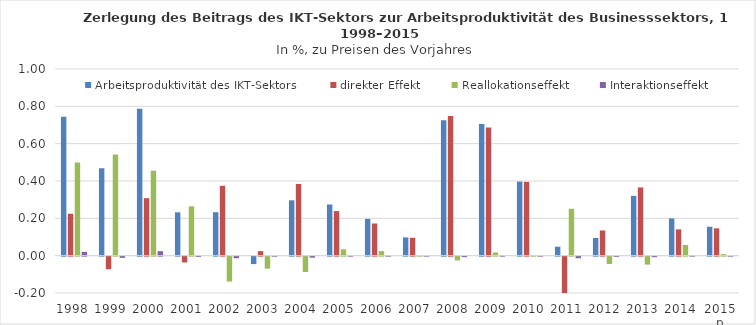
| Category | Arbeitsproduktivität des IKT-Sektors | direkter Effekt | Reallokationseffekt | Interaktionseffekt |
|---|---|---|---|---|
| 1998 | 0.744 | 0.225 | 0.499 | 0.02 |
| 1999 | 0.468 | -0.067 | 0.542 | -0.006 |
| 2000 | 0.787 | 0.308 | 0.455 | 0.024 |
| 2001 | 0.232 | -0.031 | 0.265 | -0.001 |
| 2002 | 0.233 | 0.374 | -0.133 | -0.008 |
| 2003 | -0.04 | 0.024 | -0.064 | 0 |
| 2004 | 0.297 | 0.384 | -0.082 | -0.005 |
| 2005 | 0.274 | 0.239 | 0.034 | 0.001 |
| 2006 | 0.197 | 0.172 | 0.024 | 0.001 |
| 2007 | 0.098 | 0.096 | 0.002 | 0 |
| 2008 | 0.726 | 0.748 | -0.02 | -0.003 |
| 2009 | 0.705 | 0.686 | 0.017 | 0.002 |
| 2010 | 0.397 | 0.395 | 0.002 | 0 |
| 2011 | 0.048 | -0.195 | 0.251 | -0.008 |
| 2012 | 0.095 | 0.135 | -0.039 | -0.001 |
| 2013 | 0.321 | 0.366 | -0.042 | -0.003 |
| 2014 | 0.2 | 0.141 | 0.057 | 0.001 |
| 2015 p | 0.155 | 0.146 | 0.008 | 0 |